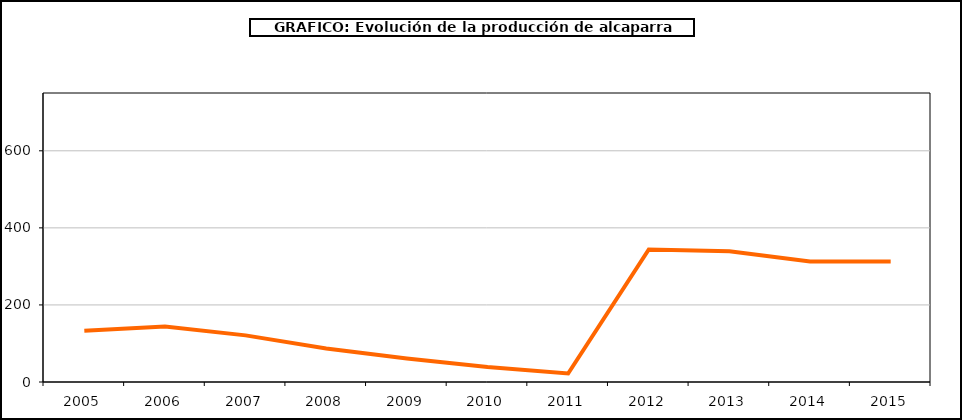
| Category | producción |
|---|---|
| 2005.0 | 133 |
| 2006.0 | 144 |
| 2007.0 | 121 |
| 2008.0 | 87 |
| 2009.0 | 61 |
| 2010.0 | 39 |
| 2011.0 | 22 |
| 2012.0 | 344 |
| 2013.0 | 339 |
| 2014.0 | 313 |
| 2015.0 | 313 |